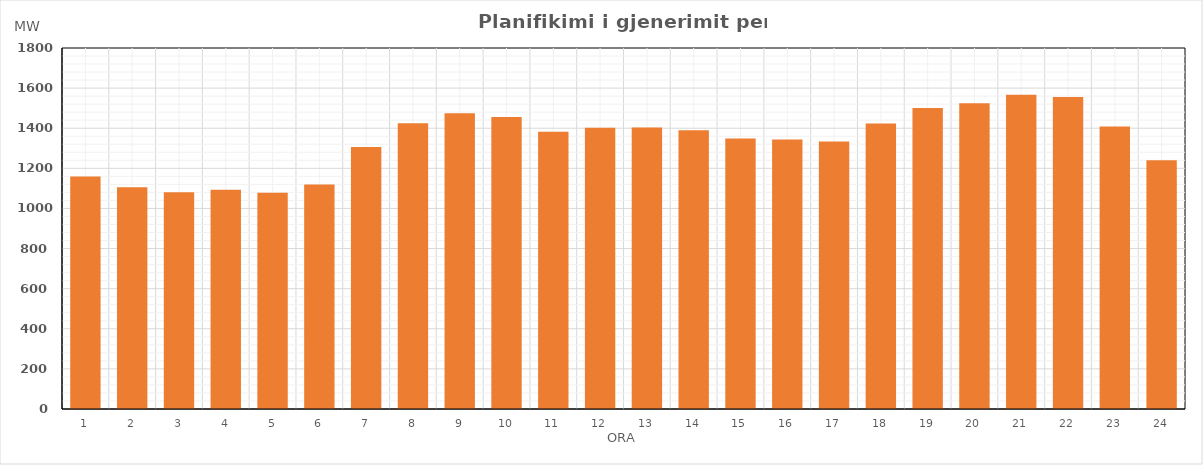
| Category | Max (MW) |
|---|---|
| 0 | 1159.242 |
| 1 | 1105.663 |
| 2 | 1081.16 |
| 3 | 1093.675 |
| 4 | 1078.781 |
| 5 | 1119.807 |
| 6 | 1306.57 |
| 7 | 1425.012 |
| 8 | 1474.617 |
| 9 | 1455.583 |
| 10 | 1382.461 |
| 11 | 1402.079 |
| 12 | 1403.431 |
| 13 | 1390.058 |
| 14 | 1348.505 |
| 15 | 1344.303 |
| 16 | 1334.194 |
| 17 | 1423.992 |
| 18 | 1500.543 |
| 19 | 1524.59 |
| 20 | 1567.356 |
| 21 | 1556.257 |
| 22 | 1408.198 |
| 23 | 1240.866 |